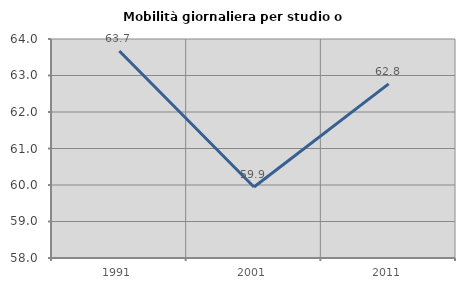
| Category | Mobilità giornaliera per studio o lavoro |
|---|---|
| 1991.0 | 63.669 |
| 2001.0 | 59.946 |
| 2011.0 | 62.772 |